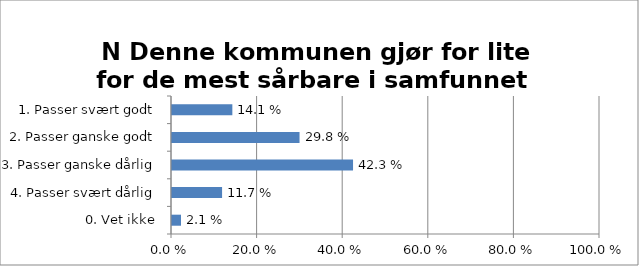
| Category | 
N Denne kommunen gjør for lite for de mest sårbare i samfunnet  |
|---|---|
| 1. Passer svært godt | 0.141 |
| 2. Passer ganske godt | 0.298 |
| 3. Passer ganske dårlig | 0.423 |
| 4. Passer svært dårlig | 0.117 |
| 0. Vet ikke | 0.021 |